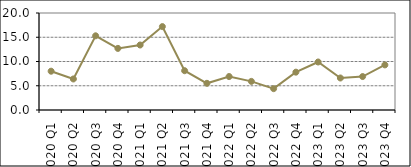
| Category | DualResult |
|---|---|
| 2020 Q1 | 8 |
| 2020 Q2 | 6.4 |
| 2020 Q3 | 15.3 |
| 2020 Q4 | 12.7 |
| 2021 Q1 | 13.4 |
| 2021 Q2 | 17.2 |
| 2021 Q3 | 8.1 |
| 2021 Q4 | 5.5 |
| 2022 Q1 | 6.9 |
| 2022 Q2 | 5.9 |
| 2022 Q3 | 4.4 |
| 2022 Q4 | 7.8 |
| 2023 Q1 | 9.9 |
| 2023 Q2 | 6.6 |
| 2023 Q3 | 6.9 |
| 2023 Q4 | 9.3 |